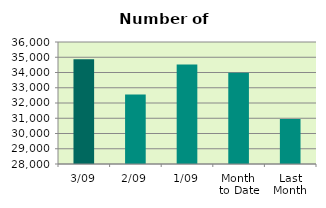
| Category | Series 0 |
|---|---|
| 3/09 | 34866 |
| 2/09 | 32560 |
| 1/09 | 34524 |
| Month 
to Date | 33983.333 |
| Last
Month | 30949.143 |